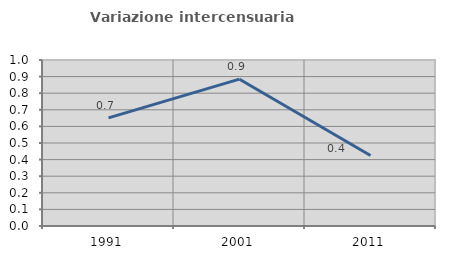
| Category | Variazione intercensuaria annua |
|---|---|
| 1991.0 | 0.651 |
| 2001.0 | 0.885 |
| 2011.0 | 0.424 |